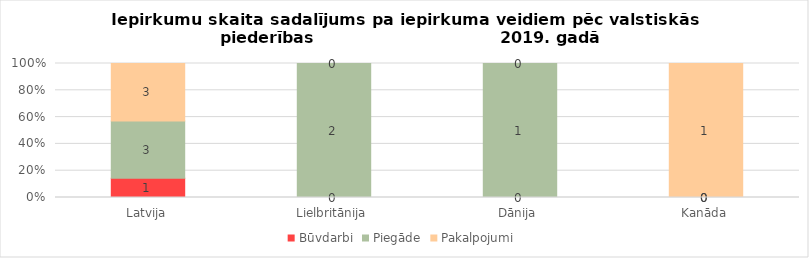
| Category | Būvdarbi | Piegāde | Pakalpojumi |
|---|---|---|---|
| Latvija | 1 | 3 | 3 |
| Lielbritānija | 0 | 2 | 0 |
| Dānija | 0 | 1 | 0 |
| Kanāda | 0 | 0 | 1 |